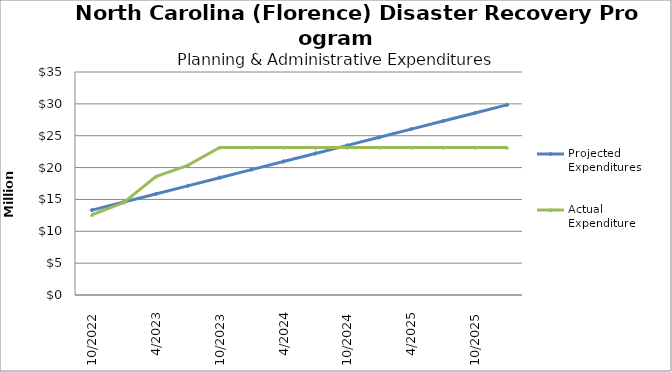
| Category | Projected Expenditures | Actual Expenditure |
|---|---|---|
| 10/2022 | 13319446 | 12595369.76 |
| 1/2023 | 14590675 | 14511875.06 |
| 4/2023 | 15861904 | 18583300.39 |
| 7/2023 | 17133133 | 20340741.63 |
| 10/2023 | 18404362 | 23153615.63 |
| 1/2024 | 19675591 | 23153615.63 |
| 4/2024 | 20946820 | 23153615.63 |
| 7/2024 | 22218049 | 23153615.63 |
| 10/2024 | 23489278 | 23153615.63 |
| 1/2025 | 24760507 | 23153615.63 |
| 4/2025 | 26031736 | 23153615.63 |
| 7/2025 | 27302965 | 23153615.63 |
| 10/2025 | 28574194 | 23153615.63 |
| 1/2026 | 29845420 | 23153615.63 |